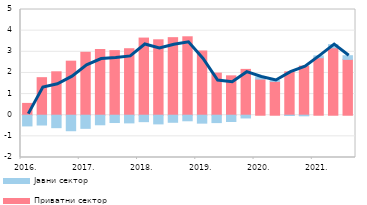
| Category | Приватни сектор | Јавни сектор |
|---|---|---|
| 2016. | 0.559 | -0.507 |
| II | 1.776 | -0.463 |
| III | 2.053 | -0.589 |
| IV | 2.556 | -0.733 |
| 2017. | 2.977 | -0.621 |
| II | 3.109 | -0.452 |
| III | 3.055 | -0.347 |
| IV | 3.145 | -0.363 |
| 2018. | 3.649 | -0.305 |
| II | 3.567 | -0.411 |
| III | 3.668 | -0.334 |
| IV | 3.71 | -0.263 |
| 2019. | 3.039 | -0.375 |
| II | 1.992 | -0.349 |
| III | 1.862 | -0.298 |
| IV | 2.168 | -0.13 |
| 2020. | 1.708 | 0.102 |
| II | 1.599 | 0.045 |
| III | 2.051 | -0.014 |
| IV | 2.322 | -0.028 |
| 2021. | 2.718 | 0.089 |
| II | 3.189 | 0.148 |
| III | 2.641 | 0.174 |